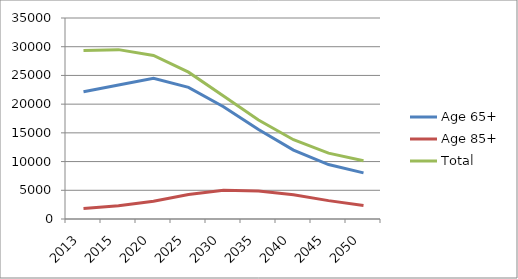
| Category | Age 65+ | Age 85+ | Total |
|---|---|---|---|
| 2013.0 | 22166.78 | 1833.88 | 29361.479 |
| 2015.0 | 23340.748 | 2308.652 | 29491.739 |
| 2020.0 | 24500.032 | 3073.892 | 28470.943 |
| 2025.0 | 22915.881 | 4265.887 | 25567.215 |
| 2030.0 | 19556.753 | 5017.487 | 21418.117 |
| 2035.0 | 15593.417 | 4869.518 | 17245.762 |
| 2040.0 | 12004.874 | 4216.826 | 13808.038 |
| 2045.0 | 9480.538 | 3200.188 | 11475.447 |
| 2050.0 | 8027.6 | 2343.086 | 10131.917 |